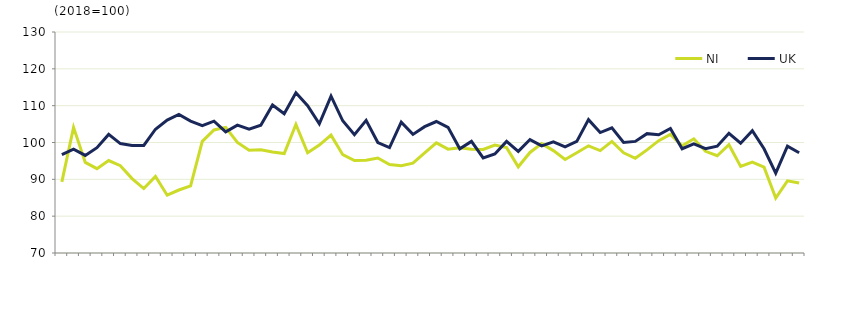
| Category | NI  | UK  |
|---|---|---|
|  | 89.3 | 96.7 |
| Q2 2005 | 104.1 | 98.2 |
|  | 94.6 | 96.5 |
| Q4 2005 | 92.9 | 98.6 |
|  | 95.1 | 102.2 |
| Q2 2006 | 93.7 | 99.7 |
|  | 90.2 | 99.2 |
| Q4 2006 | 87.5 | 99.2 |
|  | 90.8 | 103.6 |
| Q2 2007 | 85.7 | 106.1 |
|  | 87.1 | 107.6 |
| Q4 2007 | 88.2 | 105.8 |
|  | 100.3 | 104.6 |
| Q2 2008 | 103.4 | 105.8 |
|  | 104.1 | 102.9 |
| Q4 2008 | 100 | 104.7 |
|  | 97.9 | 103.6 |
| Q2 2009 | 98 | 104.7 |
|  | 97.4 | 110.2 |
| Q4 2009 | 97 | 107.8 |
|  | 104.9 | 113.5 |
| Q2 2010 | 97.2 | 110 |
|  | 99.3 | 105.1 |
| Q4 2010 | 102 | 112.6 |
|  | 96.7 | 105.9 |
| Q2 2011 | 95.1 | 102.1 |
|  | 95.2 | 106 |
| Q4 2011 | 95.8 | 100 |
|  | 94 | 98.6 |
| Q2 2012 | 93.7 | 105.5 |
|  | 94.4 | 102.2 |
| Q4 2012 | 97.2 | 104.3 |
|  | 99.9 | 105.7 |
| Q2 2013 | 98.2 | 104.1 |
|  | 98.6 | 98.3 |
| Q4 2013 | 98.2 | 100.3 |
|  | 98.1 | 95.8 |
| Q2 2014 | 99.3 | 96.9 |
|  | 98.6 | 100.3 |
| Q4 2014 | 93.4 | 97.6 |
|  | 97.3 | 100.8 |
| Q2 2015 | 99.7 | 99.1 |
|  | 97.8 | 100.2 |
| Q4 2015 | 95.4 | 98.8 |
|  | 97.2 | 100.3 |
| Q2 2016 | 99.1 | 106.2 |
|  | 97.8 | 102.7 |
| Q4 2016 | 100.3 | 104 |
|  | 97.2 | 100 |
| Q2 2017 | 95.7 | 100.3 |
|  | 98 | 102.4 |
| Q4 2017 | 100.5 | 102.1 |
|  | 102.2 | 103.8 |
| Q2 2018 | 99.1 | 98.3 |
|  | 101 | 99.6 |
| Q4 2018 | 97.6 | 98.3 |
|  | 96.4 | 99 |
| Q2 2019 | 99.4 | 102.5 |
|  | 93.5 | 99.8 |
| Q4 2019 | 94.7 | 103.2 |
|  | 93.3 | 98.3 |
| Q2 2020 | 84.9 | 91.7 |
|  | 89.6 | 99 |
| Q4 2020 | 89 | 97.2 |